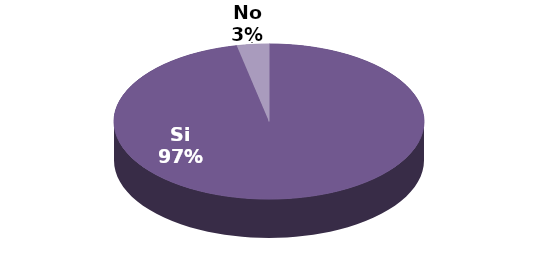
| Category | Series 1 |
|---|---|
| Si | 29 |
| No | 1 |